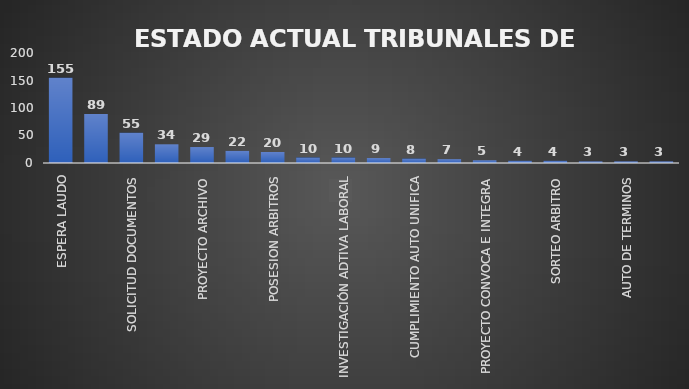
| Category | CANTIDAD | % |
|---|---|---|
| ESPERA LAUDO | 155 | 0.326 |
| RECURSO ANULACION LAUDO | 89 | 0.175 |
| SOLICITUD DOCUMENTOS | 55 | 0.118 |
| PAGO HONORARIOS | 34 | 0.067 |
| PROYECTO ARCHIVO | 29 | 0.061 |
| ESTUDIO DOCUMENTOS | 22 | 0.045 |
| POSESION ARBITROS | 20 | 0.04 |
| DESIGNACION ARBITRO | 10 | 0.027 |
| INVESTIGACIÓN ADTIVA LABORAL | 10 | 0.019 |
| FIRMA CONVOCA E INTEGRA | 9 | 0.023 |
| CUMPLIMIENTO AUTO UNIFICA | 8 | 0.017 |
| CONSTANCIA | 7 | 0.017 |
| PROYECTO CONVOCA E INTEGRA | 5 | 0.011 |
| PROYECTO RECURSO REPOSICION | 4 | 0.009 |
| SORTEO ARBITRO | 4 | 0.01 |
| PROYECTO MODIFICA RESOLUCION | 3 | 0.005 |
| AUTO DE TERMINOS | 3 | 0.005 |
| PROYECTO AUTO UNIFICA | 3 | 0.006 |